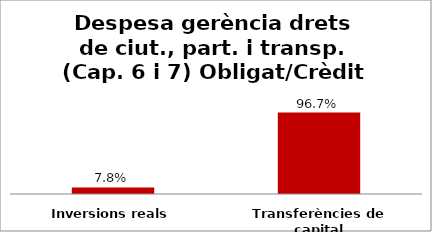
| Category | Series 0 |
|---|---|
| Inversions reals | 0.078 |
| Transferències de capital | 0.967 |